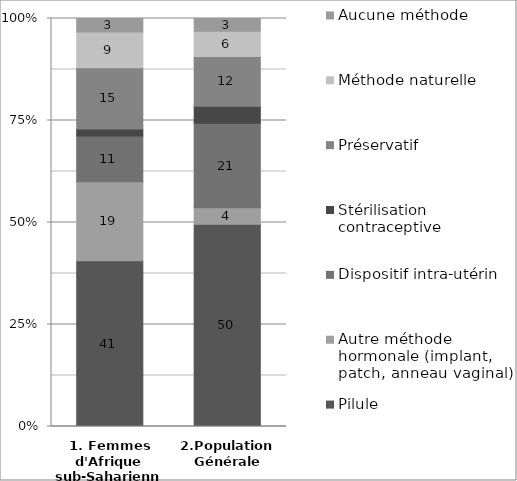
| Category | Pilule | Autre méthode hormonale (implant, patch, anneau vaginal) | Dispositif intra-utérin | Stérilisation contraceptive | Préservatif | Méthode naturelle | Aucune méthode |
|---|---|---|---|---|---|---|---|
| 1. Femmes d'Afrique sub-Saharienne | 40.6 | 19.4 | 11.2 | 1.7 | 15 | 8.8 | 3.3 |
| 2.Population Générale | 49.6 | 4 | 20.7 | 4.2 | 12.2 | 6.2 | 3.1 |